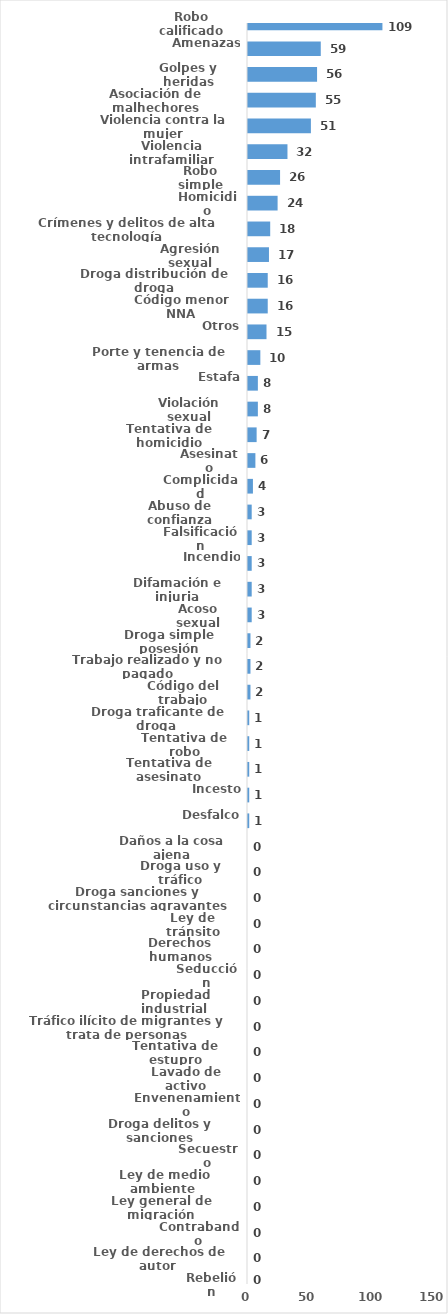
| Category | Series 0 |
|---|---|
| Robo calificado | 109 |
| Amenazas | 59 |
| Golpes y heridas | 56 |
| Asociación de malhechores | 55 |
| Violencia contra la mujer | 51 |
| Violencia intrafamiliar | 32 |
| Robo simple | 26 |
| Homicidio | 24 |
| Crímenes y delitos de alta tecnología | 18 |
| Agresión sexual | 17 |
| Droga distribución de droga | 16 |
| Código menor NNA | 16 |
| Otros | 15 |
| Porte y tenencia de armas | 10 |
| Estafa | 8 |
| Violación sexual | 8 |
| Tentativa de homicidio | 7 |
| Asesinato | 6 |
| Complicidad | 4 |
| Abuso de confianza | 3 |
| Falsificación | 3 |
| Incendio | 3 |
| Difamación e injuria | 3 |
| Acoso sexual | 3 |
| Droga simple posesión | 2 |
| Trabajo realizado y no pagado | 2 |
| Código del trabajo | 2 |
| Droga traficante de droga  | 1 |
| Tentativa de robo | 1 |
| Tentativa de asesinato | 1 |
| Incesto | 1 |
| Desfalco | 1 |
| Daños a la cosa ajena | 0 |
| Droga uso y tráfico | 0 |
| Droga sanciones y circunstancias agravantes | 0 |
| Ley de tránsito | 0 |
| Derechos humanos | 0 |
| Seducción | 0 |
| Propiedad industrial  | 0 |
| Tráfico ilícito de migrantes y trata de personas | 0 |
| Tentativa de estupro | 0 |
| Lavado de activo | 0 |
| Envenenamiento | 0 |
| Droga delitos y sanciones | 0 |
| Secuestro | 0 |
| Ley de medio ambiente  | 0 |
| Ley general de migración | 0 |
| Contrabando | 0 |
| Ley de derechos de autor  | 0 |
| Rebelión | 0 |